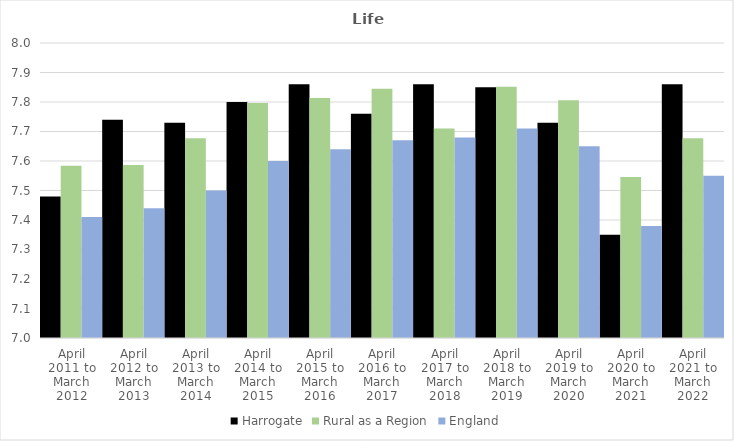
| Category | Harrogate | Rural as a Region | England |
|---|---|---|---|
| April 2011 to March 2012 | 7.48 | 7.584 | 7.41 |
| April 2012 to March 2013 | 7.74 | 7.586 | 7.44 |
| April 2013 to March 2014 | 7.73 | 7.677 | 7.5 |
| April 2014 to March 2015 | 7.8 | 7.797 | 7.6 |
| April 2015 to March 2016 | 7.86 | 7.813 | 7.64 |
| April 2016 to March 2017 | 7.76 | 7.845 | 7.67 |
| April 2017 to March 2018 | 7.86 | 7.71 | 7.68 |
| April 2018 to March 2019 | 7.85 | 7.852 | 7.71 |
| April 2019 to March 2020 | 7.73 | 7.806 | 7.65 |
| April 2020 to March 2021 | 7.35 | 7.546 | 7.38 |
| April 2021 to March 2022 | 7.86 | 7.677 | 7.55 |